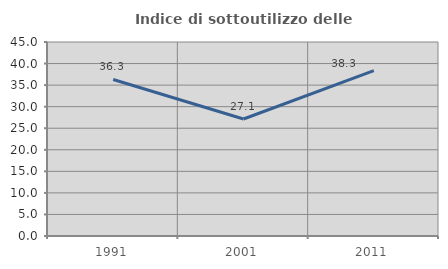
| Category | Indice di sottoutilizzo delle abitazioni  |
|---|---|
| 1991.0 | 36.313 |
| 2001.0 | 27.136 |
| 2011.0 | 38.342 |